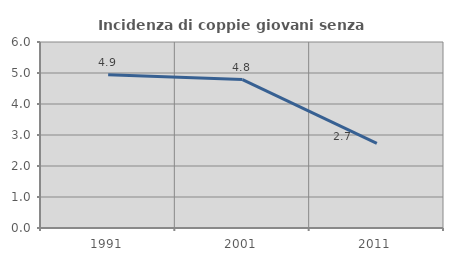
| Category | Incidenza di coppie giovani senza figli |
|---|---|
| 1991.0 | 4.942 |
| 2001.0 | 4.789 |
| 2011.0 | 2.732 |